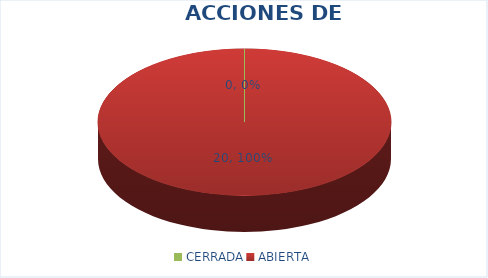
| Category | Series 0 |
|---|---|
| CERRADA | 0 |
| ABIERTA | 20 |